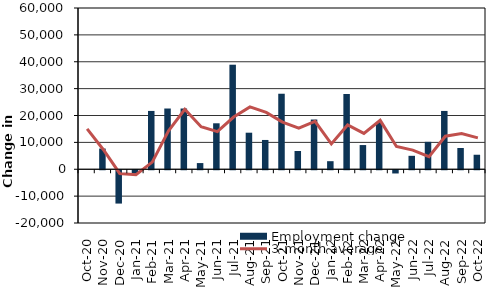
| Category | Employment change |
|---|---|
| 2020-10-01 | 0 |
| 2020-11-01 | 7700 |
| 2020-12-01 | -12400 |
| 2021-01-01 | -1300 |
| 2021-02-01 | 21700 |
| 2021-03-01 | 22600 |
| 2021-04-01 | 22600 |
| 2021-05-01 | 2300 |
| 2021-06-01 | 17100 |
| 2021-07-01 | 38900 |
| 2021-08-01 | 13600 |
| 2021-09-01 | 10900 |
| 2021-10-01 | 28100 |
| 2021-11-01 | 6800 |
| 2021-12-01 | 18500 |
| 2022-01-01 | 3000 |
| 2022-02-01 | 28000 |
| 2022-03-01 | 9000 |
| 2022-04-01 | 17600 |
| 2022-05-01 | -1200 |
| 2022-06-01 | 5000 |
| 2022-07-01 | 10200 |
| 2022-08-01 | 21700 |
| 2022-09-01 | 7900 |
| 2022-10-01 | 5400 |